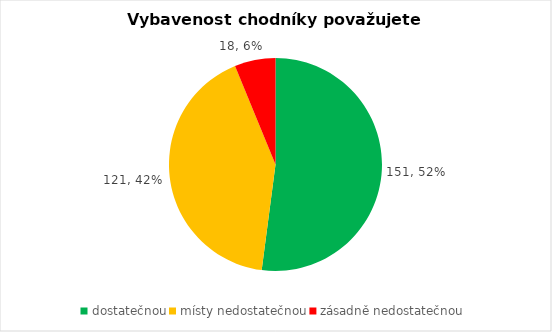
| Category | Series 0 |
|---|---|
| dostatečnou | 151 |
| místy nedostatečnou | 121 |
| zásadně nedostatečnou | 18 |